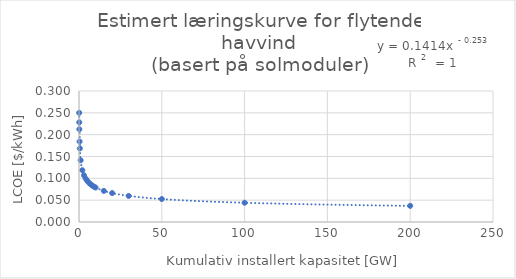
| Category | y |
|---|---|
| 0.105 | 0.25 |
| 0.15 | 0.228 |
| 0.2 | 0.212 |
| 0.35 | 0.184 |
| 0.5 | 0.168 |
| 1.0 | 0.141 |
| 2.0 | 0.119 |
| 3.0 | 0.107 |
| 4.0 | 0.1 |
| 5.0 | 0.094 |
| 6.0 | 0.09 |
| 7.0 | 0.086 |
| 8.0 | 0.084 |
| 9.0 | 0.081 |
| 10.0 | 0.079 |
| 15.0 | 0.071 |
| 20.0 | 0.066 |
| 30.0 | 0.06 |
| 50.0 | 0.053 |
| 100.0 | 0.044 |
| 200.0 | 0.037 |